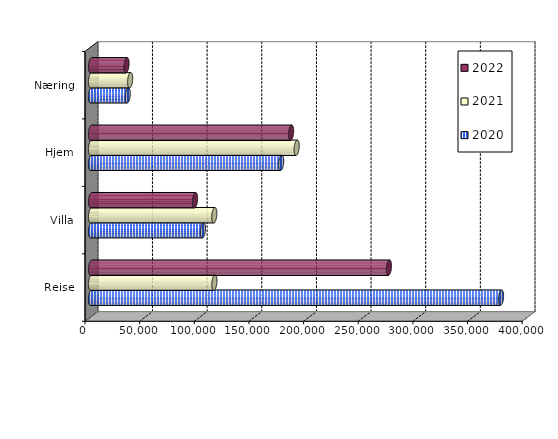
| Category | 2020 | 2021 | 2022 |
|---|---|---|---|
| Reise | 375186 | 112892.846 | 272587 |
| Villa | 102401.976 | 112820.346 | 95185.337 |
| Hjem | 173987.33 | 188188.29 | 183082.731 |
| Næring | 33616.306 | 35814.895 | 32504.417 |